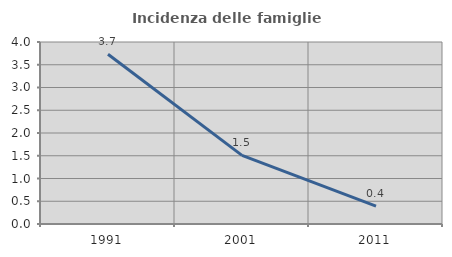
| Category | Incidenza delle famiglie numerose |
|---|---|
| 1991.0 | 3.73 |
| 2001.0 | 1.508 |
| 2011.0 | 0.394 |